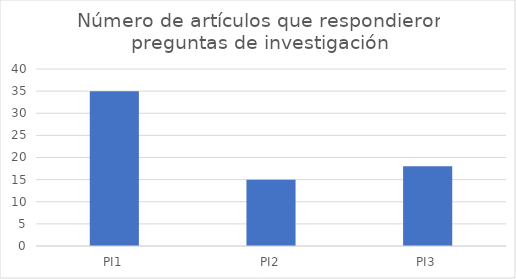
| Category | Artículos que respondieron preguntas de investigación |
|---|---|
| PI1 | 35 |
| PI2 | 15 |
| PI3 | 18 |